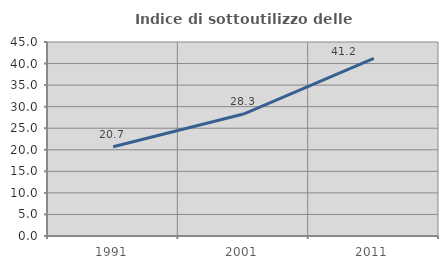
| Category | Indice di sottoutilizzo delle abitazioni  |
|---|---|
| 1991.0 | 20.712 |
| 2001.0 | 28.282 |
| 2011.0 | 41.199 |